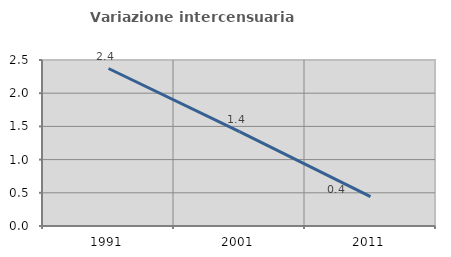
| Category | Variazione intercensuaria annua |
|---|---|
| 1991.0 | 2.372 |
| 2001.0 | 1.422 |
| 2011.0 | 0.443 |